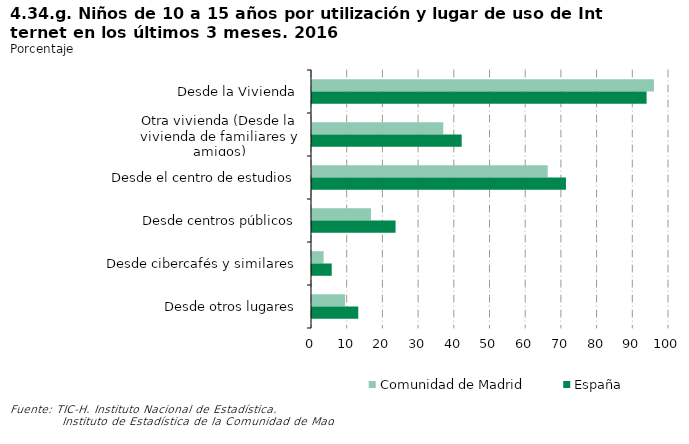
| Category | Comunidad de Madrid | España |
|---|---|---|
| Desde la Vivienda | 95.786 | 93.722 |
| Otra vivienda (Desde la vivienda de familiares y amigos) | 36.763 | 41.929 |
| Desde el centro de estudios | 66.027 | 71.137 |
| Desde centros públicos | 16.515 | 23.403 |
| Desde cibercafés y similares | 3.253 | 5.522 |
| Desde otros lugares | 9.273 | 12.957 |